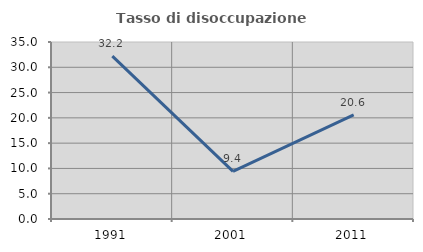
| Category | Tasso di disoccupazione giovanile  |
|---|---|
| 1991.0 | 32.222 |
| 2001.0 | 9.434 |
| 2011.0 | 20.588 |